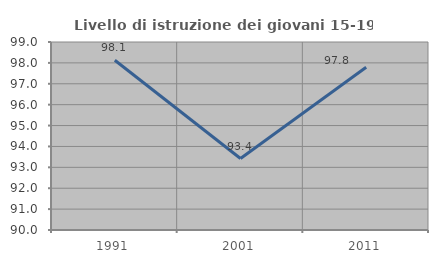
| Category | Livello di istruzione dei giovani 15-19 anni |
|---|---|
| 1991.0 | 98.125 |
| 2001.0 | 93.421 |
| 2011.0 | 97.794 |